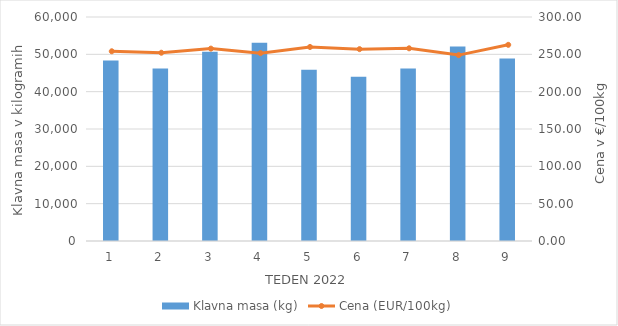
| Category | Klavna masa (kg) |
|---|---|
| 1.0 | 48349 |
| 2.0 | 46187 |
| 3.0 | 50692 |
| 4.0 | 53081 |
| 5.0 | 45844 |
| 6.0 | 43982 |
| 7.0 | 46227 |
| 8.0 | 52099 |
| 9.0 | 48872 |